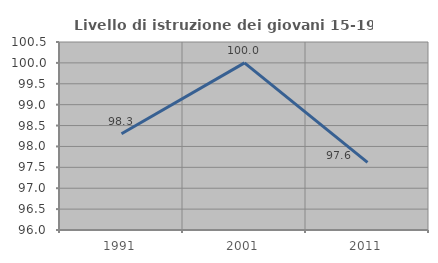
| Category | Livello di istruzione dei giovani 15-19 anni |
|---|---|
| 1991.0 | 98.305 |
| 2001.0 | 100 |
| 2011.0 | 97.619 |